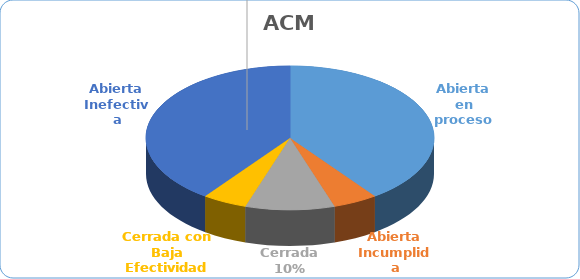
| Category | Series 0 |
|---|---|
| Abierta en proceso | 8 |
| Abierta Incumplida | 1 |
| Cerrada | 2 |
| Cerrada con Baja Efectividad | 1 |
| Abierta Inefectiva | 8 |